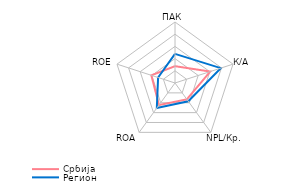
| Category | Србија | Регион |
|---|---|---|
| ПАК | 1.38 | 2.389 |
| К/А | 3.035 | 3.946 |
| NPL/Кр. | 1.654 | 1.853 |
| ROA | 2.234 | 2.536 |
| ROE | 2.038 | 1.457 |